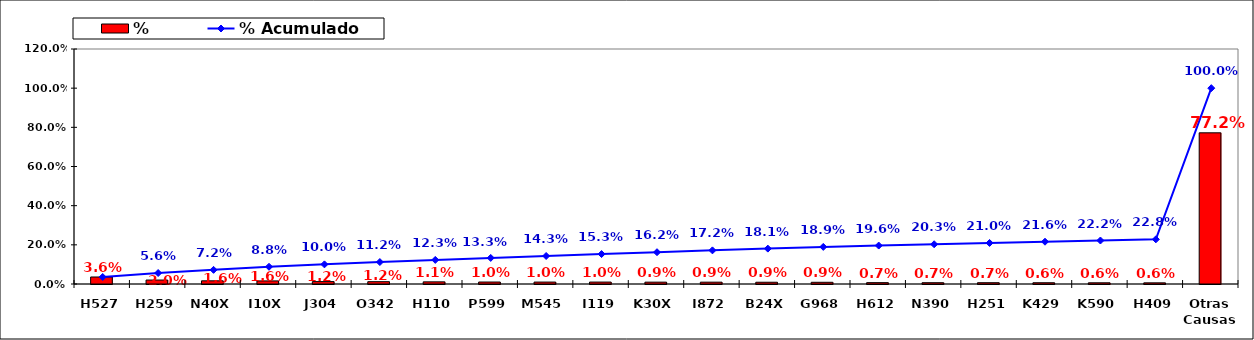
| Category | % |
|---|---|
| H527 | 0.036 |
| H259 | 0.02 |
| N40X | 0.016 |
| I10X | 0.016 |
| J304 | 0.012 |
| O342 | 0.012 |
| H110 | 0.011 |
| P599 | 0.01 |
| M545 | 0.01 |
| I119 | 0.01 |
| K30X | 0.009 |
| I872 | 0.009 |
| B24X | 0.009 |
| G968 | 0.009 |
| H612 | 0.007 |
| N390 | 0.007 |
| H251 | 0.007 |
| K429 | 0.006 |
| K590 | 0.006 |
| H409 | 0.006 |
| Otras Causas | 0.772 |